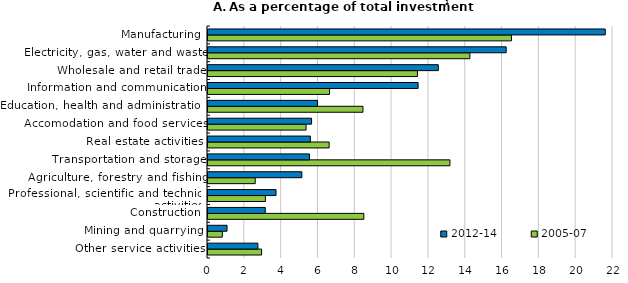
| Category | 2005-07 | 2012-14 |
|---|---|---|
| Other service activities | 2.912 | 2.709 |
| Mining and quarrying | 0.779 | 1.034 |
| Construction | 8.466 | 3.111 |
| Professional, scientific and technical activities | 3.119 | 3.695 |
| Agriculture, forestry and fishing | 2.565 | 5.099 |
| Transportation and storage | 13.142 | 5.515 |
| Real estate activities | 6.581 | 5.56 |
| Accomodation and food services | 5.326 | 5.626 |
| Education, health and administration | 8.418 | 5.951 |
| Information and communication | 6.602 | 11.414 |
| Wholesale and retail trade | 11.379 | 12.51 |
| Electricity, gas, water and waste | 14.227 | 16.197 |
| Manufacturing | 16.484 | 21.58 |